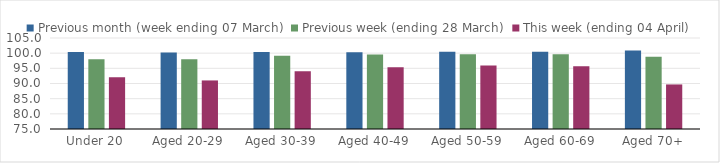
| Category | Previous month (week ending 07 March) | Previous week (ending 28 March) | This week (ending 04 April) |
|---|---|---|---|
| Under 20 | 100.405 | 98.021 | 92.034 |
| Aged 20-29 | 100.232 | 97.971 | 91.008 |
| Aged 30-39 | 100.361 | 99.17 | 94.026 |
| Aged 40-49 | 100.342 | 99.556 | 95.318 |
| Aged 50-59 | 100.455 | 99.617 | 95.953 |
| Aged 60-69 | 100.48 | 99.633 | 95.707 |
| Aged 70+ | 100.868 | 98.858 | 89.689 |